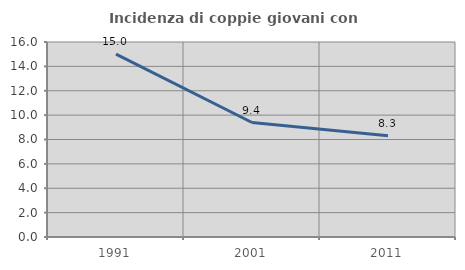
| Category | Incidenza di coppie giovani con figli |
|---|---|
| 1991.0 | 15.009 |
| 2001.0 | 9.392 |
| 2011.0 | 8.314 |